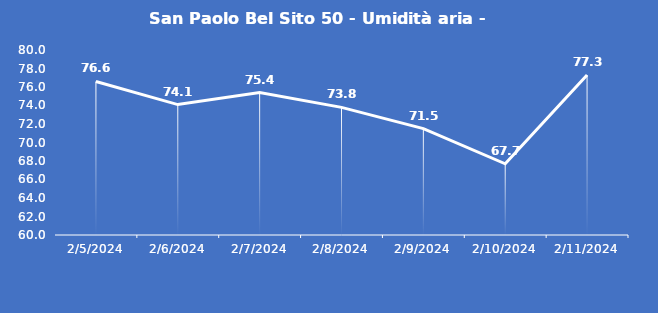
| Category | San Paolo Bel Sito 50 - Umidità aria - Grezzo (%) |
|---|---|
| 2/5/24 | 76.6 |
| 2/6/24 | 74.1 |
| 2/7/24 | 75.4 |
| 2/8/24 | 73.8 |
| 2/9/24 | 71.5 |
| 2/10/24 | 67.7 |
| 2/11/24 | 77.3 |